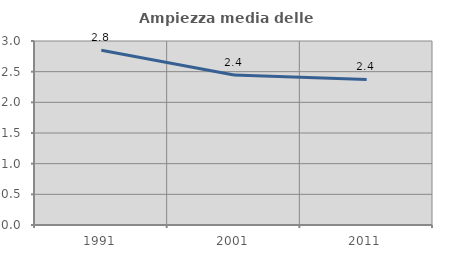
| Category | Ampiezza media delle famiglie |
|---|---|
| 1991.0 | 2.85 |
| 2001.0 | 2.446 |
| 2011.0 | 2.373 |